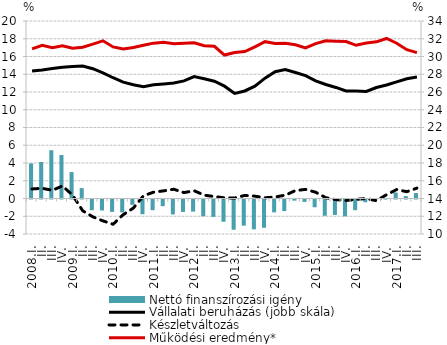
| Category | Nettó finanszírozási igény |
|---|---|
| 2008.I. | 3.953 |
| II. | 4.111 |
| III. | 5.439 |
| IV. | 4.897 |
| 2009.I. | 2.976 |
| II. | 1.172 |
| III. | -1.202 |
| IV. | -1.236 |
| 2010.I. | -1.395 |
| II. | -1.45 |
| III. | -0.599 |
| IV. | -1.66 |
| 2011.I. | -1.204 |
| II. | -0.75 |
| III. | -1.683 |
| IV. | -1.401 |
| 2012.I. | -1.365 |
| II. | -1.886 |
| III. | -1.959 |
| IV. | -2.504 |
| 2013.I. | -3.407 |
| II. | -2.95 |
| III. | -3.365 |
| IV. | -3.188 |
| 2014.I. | -1.447 |
| II. | -1.304 |
| III. | -0.127 |
| IV. | -0.272 |
| 2015.I. | -0.874 |
| II. | -1.835 |
| III. | -1.736 |
| IV. | -1.898 |
| 2016.I. | -1.205 |
| II. | -0.304 |
| III. | -0.099 |
| IV. | 0.056 |
| 2017.I. | 0.673 |
| II. | 0.271 |
| III. | 0.615 |